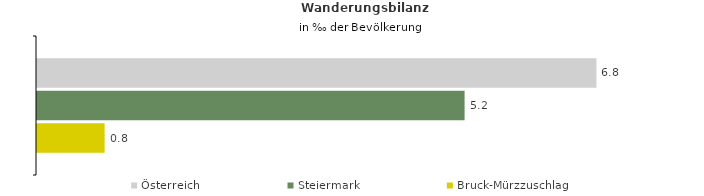
| Category | Österreich | Steiermark | Bruck-Mürzzuschlag |
|---|---|---|---|
| Wanderungsrate in ‰ der Bevölkerung, Periode 2015-2019 | 6.771 | 5.175 | 0.818 |